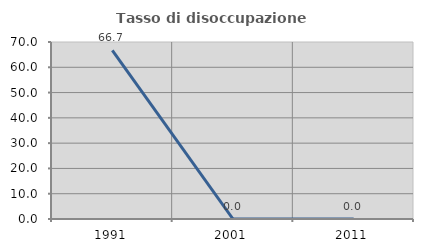
| Category | Tasso di disoccupazione giovanile  |
|---|---|
| 1991.0 | 66.667 |
| 2001.0 | 0 |
| 2011.0 | 0 |